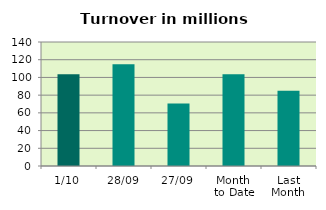
| Category | Series 0 |
|---|---|
| 1/10 | 103.701 |
| 28/09 | 114.741 |
| 27/09 | 70.638 |
| Month 
to Date | 103.701 |
| Last
Month | 85.072 |